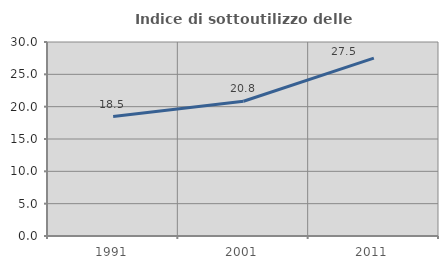
| Category | Indice di sottoutilizzo delle abitazioni  |
|---|---|
| 1991.0 | 18.471 |
| 2001.0 | 20.833 |
| 2011.0 | 27.513 |